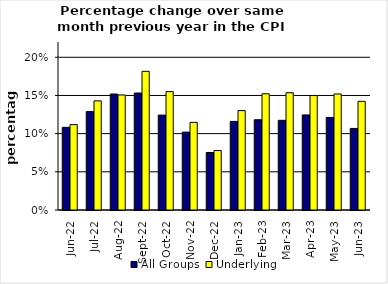
| Category | All Groups | Underlying |
|---|---|---|
| 2022-06-01 | 0.108 | 0.112 |
| 2022-07-01 | 0.129 | 0.143 |
| 2022-08-01 | 0.152 | 0.151 |
| 2022-09-01 | 0.153 | 0.182 |
| 2022-10-01 | 0.124 | 0.155 |
| 2022-11-01 | 0.102 | 0.115 |
| 2022-12-01 | 0.075 | 0.078 |
| 2023-01-01 | 0.116 | 0.13 |
| 2023-02-01 | 0.118 | 0.152 |
| 2023-03-01 | 0.117 | 0.154 |
| 2023-04-01 | 0.124 | 0.15 |
| 2023-05-01 | 0.121 | 0.152 |
| 2023-06-01 | 0.107 | 0.142 |